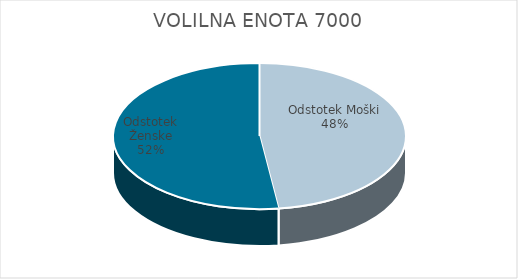
| Category | VOLILNA ENOTA 7000 | #REF! | Slovenija skupaj |
|---|---|---|---|
| Odstotek Moški | 18.07 |  | 19.85 |
| Odstotek Ženske | 19.63 |  | 21.47 |